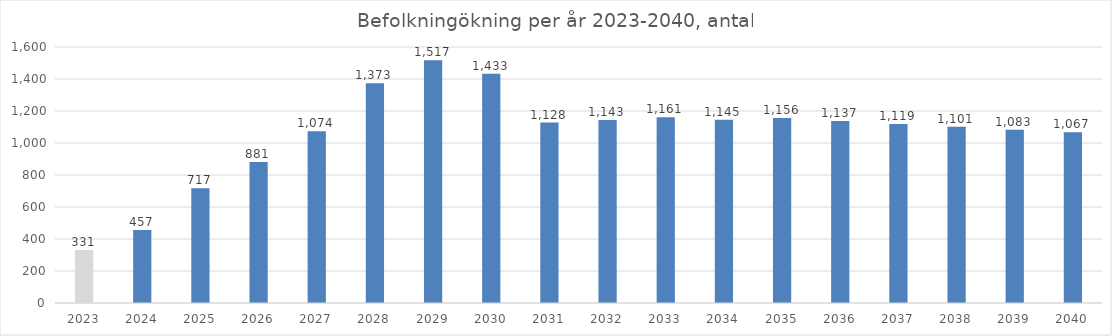
| Category | Series 0 |
|---|---|
| 2023.0 | 331 |
| 2024.0 | 456.685 |
| 2025.0 | 717.341 |
| 2026.0 | 880.998 |
| 2027.0 | 1074.163 |
| 2028.0 | 1373.299 |
| 2029.0 | 1516.747 |
| 2030.0 | 1432.866 |
| 2031.0 | 1127.967 |
| 2032.0 | 1143.003 |
| 2033.0 | 1160.93 |
| 2034.0 | 1145.385 |
| 2035.0 | 1155.542 |
| 2036.0 | 1137.182 |
| 2037.0 | 1119.285 |
| 2038.0 | 1101.085 |
| 2039.0 | 1083.452 |
| 2040.0 | 1066.537 |